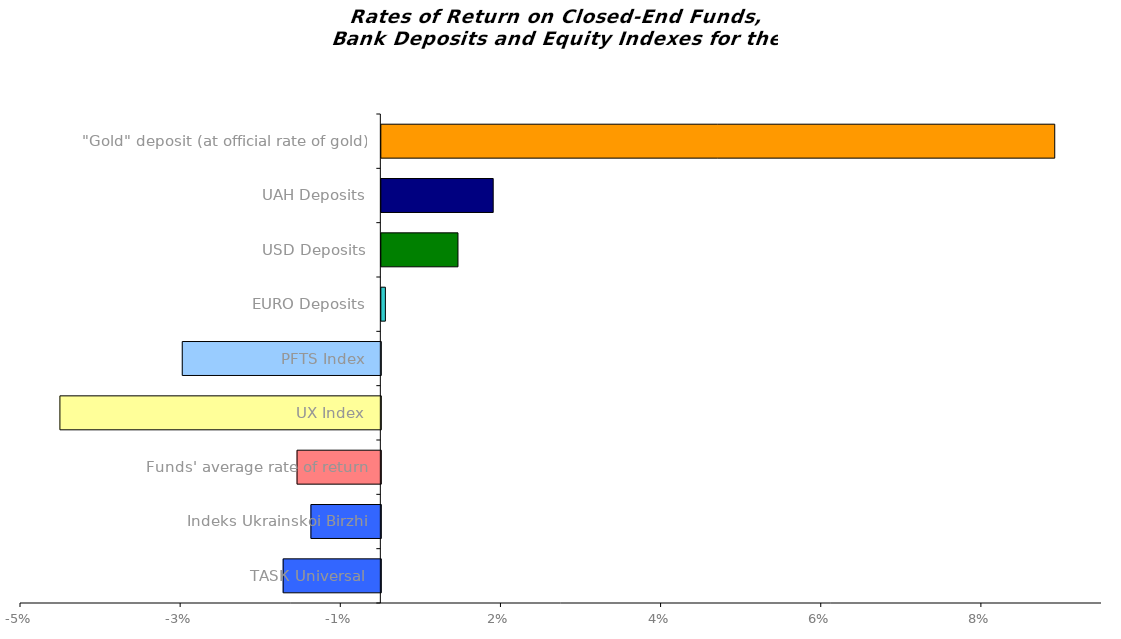
| Category | Series 0 |
|---|---|
| ТАSК Universal | -0.012 |
| Іndeks Ukrainskoi Birzhi | -0.009 |
| Funds' average rate of return | -0.01 |
| UX Index | -0.04 |
| PFTS Index | -0.025 |
| EURO Deposits | 0.001 |
| USD Deposits | 0.01 |
| UAH Deposits | 0.014 |
| "Gold" deposit (at official rate of gold) | 0.084 |